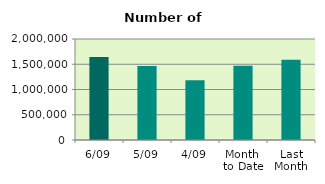
| Category | Series 0 |
|---|---|
| 6/09 | 1641158 |
| 5/09 | 1465886 |
| 4/09 | 1184690 |
| Month 
to Date | 1469696.5 |
| Last
Month | 1590000.087 |